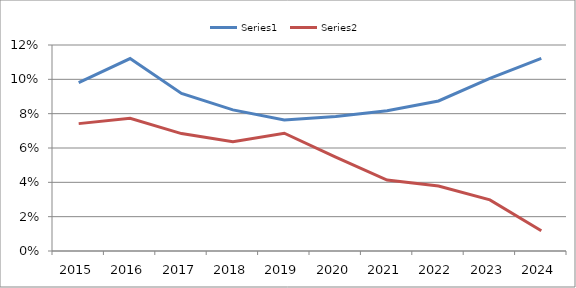
| Category | Series 0 | Series 1 |
|---|---|---|
| 2015.0 | 0.098 | 0.074 |
| 2016.0 | 0.112 | 0.077 |
| 2017.0 | 0.092 | 0.068 |
| 2018.0 | 0.082 | 0.064 |
| 2019.0 | 0.076 | 0.069 |
| 2020.0 | 0.078 | 0.055 |
| 2021.0 | 0.082 | 0.041 |
| 2022.0 | 0.087 | 0.038 |
| 2023.0 | 0.1 | 0.03 |
| 2024.0 | 0.112 | 0.012 |